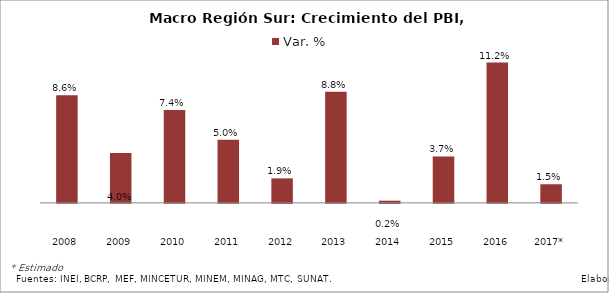
| Category | Var. % |
|---|---|
| 2008 | 0.086 |
| 2009 | 0.04 |
| 2010 | 0.074 |
| 2011 | 0.05 |
| 2012 | 0.019 |
| 2013 | 0.088 |
| 2014 | 0.002 |
| 2015 | 0.037 |
| 2016 | 0.112 |
| 2017* | 0.015 |